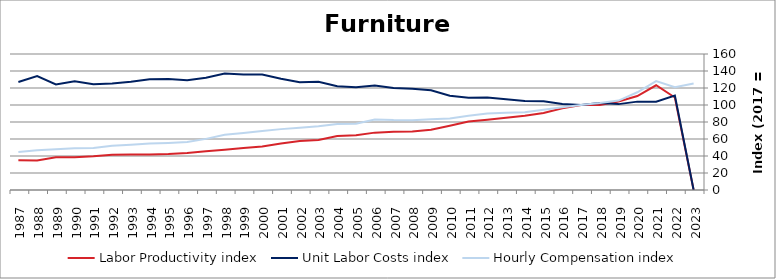
| Category | Labor Productivity index | Unit Labor Costs index | Hourly Compensation index |
|---|---|---|---|
| 2023.0 | 0 | 0 | 125.348 |
| 2022.0 | 108.829 | 111.036 | 120.839 |
| 2021.0 | 123.226 | 103.928 | 128.066 |
| 2020.0 | 110.587 | 103.97 | 114.977 |
| 2019.0 | 104.086 | 101.036 | 105.164 |
| 2018.0 | 99.979 | 102.291 | 102.27 |
| 2017.0 | 100 | 100 | 100 |
| 2016.0 | 96.272 | 101.202 | 97.429 |
| 2015.0 | 90.576 | 104.383 | 94.546 |
| 2014.0 | 87.32 | 104.799 | 91.511 |
| 2013.0 | 85.119 | 106.837 | 90.939 |
| 2012.0 | 82.712 | 108.704 | 89.911 |
| 2011.0 | 80.563 | 108.407 | 87.336 |
| 2010.0 | 75.678 | 110.976 | 83.985 |
| 2009.0 | 70.867 | 117.272 | 83.106 |
| 2008.0 | 68.9 | 119.253 | 82.165 |
| 2007.0 | 68.602 | 119.877 | 82.238 |
| 2006.0 | 67.491 | 122.811 | 82.886 |
| 2005.0 | 64.474 | 120.901 | 77.95 |
| 2004.0 | 63.65 | 121.986 | 77.644 |
| 2003.0 | 58.939 | 127.37 | 75.071 |
| 2002.0 | 57.727 | 126.657 | 73.115 |
| 2001.0 | 54.745 | 130.818 | 71.617 |
| 2000.0 | 51.173 | 135.821 | 69.504 |
| 1999.0 | 49.335 | 135.949 | 67.07 |
| 1998.0 | 47.46 | 136.927 | 64.986 |
| 1997.0 | 45.561 | 131.993 | 60.137 |
| 1996.0 | 43.672 | 129.084 | 56.374 |
| 1995.0 | 42.424 | 130.631 | 55.418 |
| 1994.0 | 41.889 | 130.416 | 54.63 |
| 1993.0 | 41.799 | 127.402 | 53.252 |
| 1992.0 | 41.459 | 125.283 | 51.941 |
| 1991.0 | 39.677 | 124.417 | 49.365 |
| 1990.0 | 38.47 | 127.875 | 49.194 |
| 1989.0 | 38.533 | 124.206 | 47.86 |
| 1988.0 | 34.836 | 134.046 | 46.696 |
| 1987.0 | 35.122 | 127.139 | 44.654 |